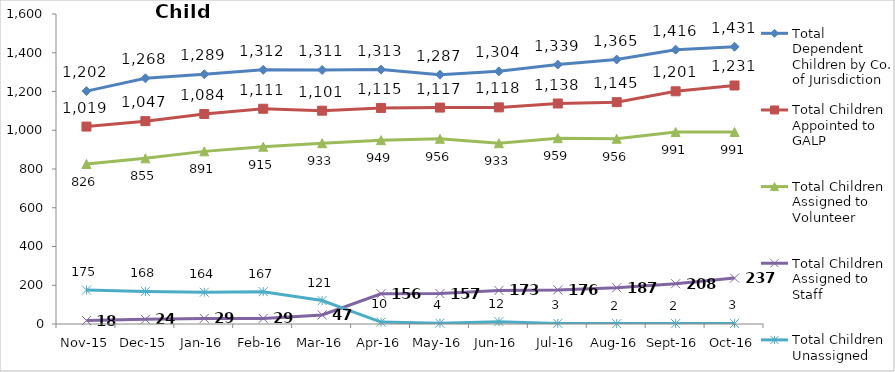
| Category | Total Dependent Children by Co. of Jurisdiction | Total Children Appointed to GALP | Total Children Assigned to Volunteer | Total Children Assigned to Staff | Total Children Unassigned |
|---|---|---|---|---|---|
| Nov-15 | 1202 | 1019 | 826 | 18 | 175 |
| Dec-15 | 1268 | 1047 | 855 | 24 | 168 |
| Jan-16 | 1289 | 1084 | 891 | 29 | 164 |
| Feb-16 | 1312 | 1111 | 915 | 29 | 167 |
| Mar-16 | 1311 | 1101 | 933 | 47 | 121 |
| Apr-16 | 1313 | 1115 | 949 | 156 | 10 |
| May-16 | 1287 | 1117 | 956 | 157 | 4 |
| Jun-16 | 1304 | 1118 | 933 | 173 | 12 |
| Jul-16 | 1339 | 1138 | 959 | 176 | 3 |
| Aug-16 | 1365 | 1145 | 956 | 187 | 2 |
| Sep-16 | 1416 | 1201 | 991 | 208 | 2 |
| Oct-16 | 1431 | 1231 | 991 | 237 | 3 |